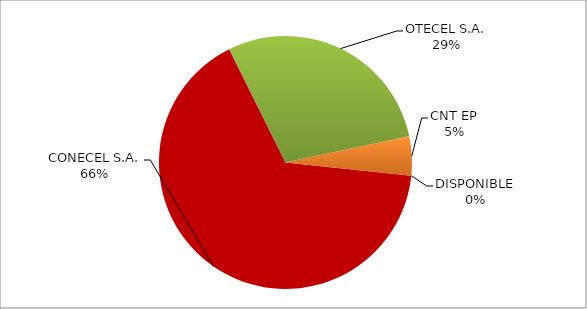
| Category | CÓDIGO DE RED 98 |
|---|---|
| CONECEL S.A. | 0.66 |
| OTECEL S.A. | 0.29 |
| CNT EP | 0.05 |
| DISPONIBLE | 0 |